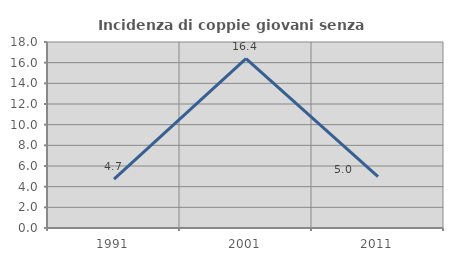
| Category | Incidenza di coppie giovani senza figli |
|---|---|
| 1991.0 | 4.739 |
| 2001.0 | 16.393 |
| 2011.0 | 4.961 |